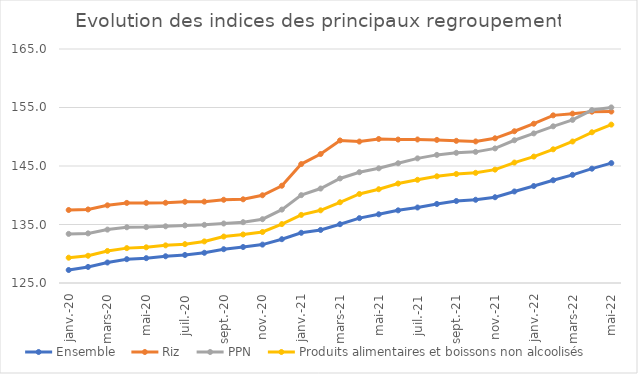
| Category |  Ensemble  |  Riz  |  PPN  |  Produits alimentaires et boissons non alcoolisés  |
|---|---|---|---|---|
| 2020-01-01 | 127.22 | 137.477 | 133.394 | 129.324 |
| 2020-02-01 | 127.747 | 137.571 | 133.482 | 129.658 |
| 2020-03-01 | 128.503 | 138.279 | 134.127 | 130.477 |
| 2020-04-01 | 129.073 | 138.691 | 134.528 | 130.962 |
| 2020-05-01 | 129.246 | 138.695 | 134.553 | 131.1 |
| 2020-06-01 | 129.569 | 138.715 | 134.691 | 131.433 |
| 2020-07-01 | 129.792 | 138.884 | 134.842 | 131.639 |
| 2020-08-01 | 130.165 | 138.908 | 134.939 | 132.108 |
| 2020-09-01 | 130.779 | 139.227 | 135.17 | 132.94 |
| 2020-10-01 | 131.152 | 139.307 | 135.396 | 133.293 |
| 2020-11-01 | 131.562 | 139.996 | 135.904 | 133.717 |
| 2020-12-01 | 132.488 | 141.627 | 137.548 | 135.07 |
| 2021-01-01 | 133.582 | 145.33 | 140.014 | 136.64 |
| 2021-02-01 | 134.068 | 147.047 | 141.147 | 137.422 |
| 2021-03-01 | 135.051 | 149.367 | 142.872 | 138.8 |
| 2021-04-01 | 136.088 | 149.178 | 143.938 | 140.217 |
| 2021-05-01 | 136.75 | 149.619 | 144.606 | 141.028 |
| 2021-06-01 | 137.421 | 149.519 | 145.469 | 142.002 |
| 2021-07-01 | 137.905 | 149.532 | 146.302 | 142.639 |
| 2021-08-01 | 138.51 | 149.461 | 146.899 | 143.242 |
| 2021-09-01 | 139.014 | 149.302 | 147.252 | 143.631 |
| 2021-10-01 | 139.227 | 149.196 | 147.416 | 143.832 |
| 2021-11-01 | 139.66 | 149.736 | 148.006 | 144.381 |
| 2021-12-01 | 140.647 | 150.942 | 149.401 | 145.589 |
| 2022-01-01 | 141.575 | 152.225 | 150.572 | 146.611 |
| 2022-02-01 | 142.565 | 153.658 | 151.785 | 147.854 |
| 2022-03-01 | 143.49 | 153.947 | 152.881 | 149.188 |
| 2022-04-01 | 144.542 | 154.286 | 154.56 | 150.765 |
| 2022-05-01 | 145.5 | 154.308 | 155.011 | 152.074 |